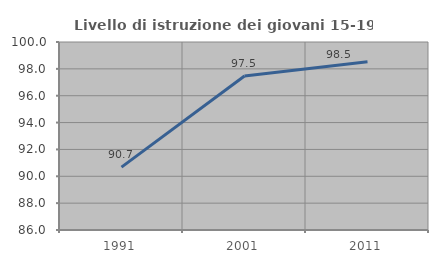
| Category | Livello di istruzione dei giovani 15-19 anni |
|---|---|
| 1991.0 | 90.683 |
| 2001.0 | 97.468 |
| 2011.0 | 98.529 |